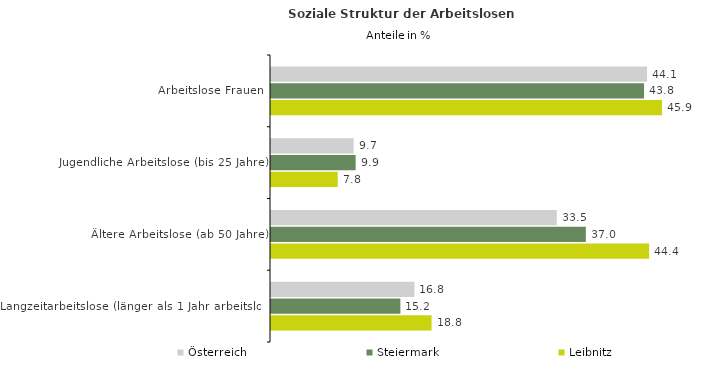
| Category | Österreich | Steiermark | Leibnitz |
|---|---|---|---|
| Arbeitslose Frauen | 44.136 | 43.785 | 45.899 |
| Jugendliche Arbeitslose (bis 25 Jahre) | 9.698 | 9.935 | 7.834 |
| Ältere Arbeitslose (ab 50 Jahre) | 33.548 | 36.954 | 44.378 |
| Langzeitarbeitslose (länger als 1 Jahr arbeitslos) | 16.836 | 15.186 | 18.848 |